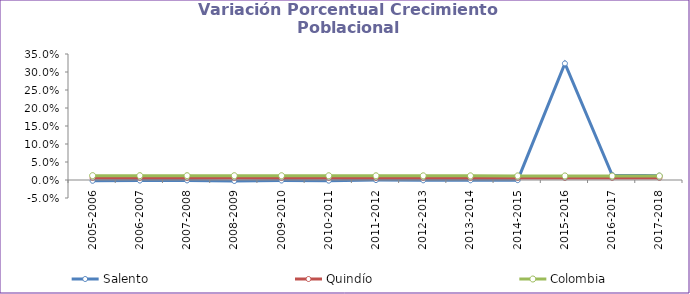
| Category | Salento | Quindío | Colombia |
|---|---|---|---|
| 2005-2006 | -0.002 | 0.006 | 0.012 |
| 2006-2007 | -0.002 | 0.006 | 0.012 |
| 2007-2008 | -0.001 | 0.006 | 0.012 |
| 2008-2009 | -0.003 | 0.006 | 0.012 |
| 2009-2010 | -0.001 | 0.006 | 0.012 |
| 2010-2011 | -0.002 | 0.006 | 0.012 |
| 2011-2012 | 0 | 0.006 | 0.012 |
| 2012-2013 | -0.001 | 0.006 | 0.012 |
| 2013-2014 | -0.001 | 0.006 | 0.011 |
| 2014-2015 | 0 | 0.006 | 0.011 |
| 2015-2016 | 0.324 | 0.006 | 0.011 |
| 2016-2017 | 0.014 | 0.006 | 0.011 |
| 2017-2018 | 0.012 | 0.006 | 0.011 |